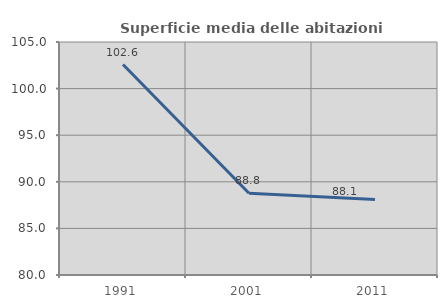
| Category | Superficie media delle abitazioni occupate |
|---|---|
| 1991.0 | 102.58 |
| 2001.0 | 88.764 |
| 2011.0 | 88.1 |